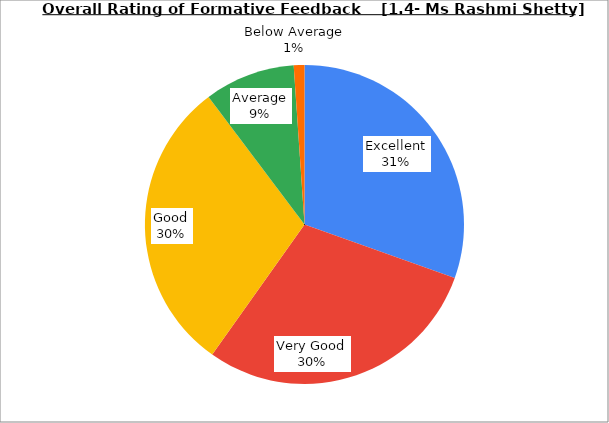
| Category | Series 0 |
|---|---|
| Excellent | 30.45 |
| Very Good | 29.369 |
| Good | 29.91 |
| Average | 9.189 |
| Below Average | 1.081 |